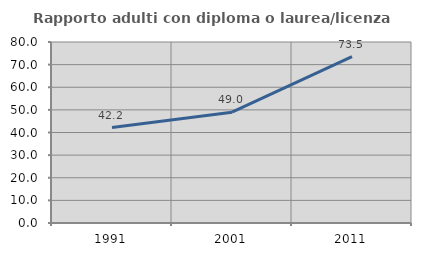
| Category | Rapporto adulti con diploma o laurea/licenza media  |
|---|---|
| 1991.0 | 42.169 |
| 2001.0 | 48.98 |
| 2011.0 | 73.514 |